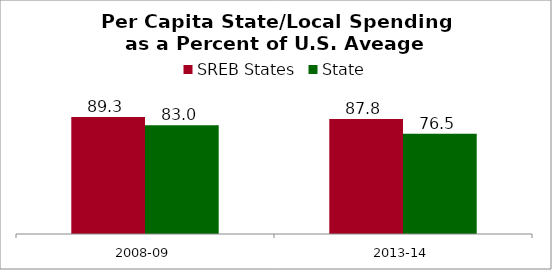
| Category | SREB States | State |
|---|---|---|
| 2008-09 | 89.32 | 82.981 |
| 2013-14 | 87.766 | 76.526 |